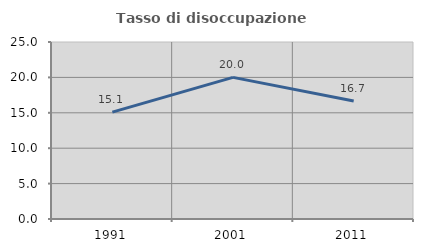
| Category | Tasso di disoccupazione giovanile  |
|---|---|
| 1991.0 | 15.094 |
| 2001.0 | 20 |
| 2011.0 | 16.667 |